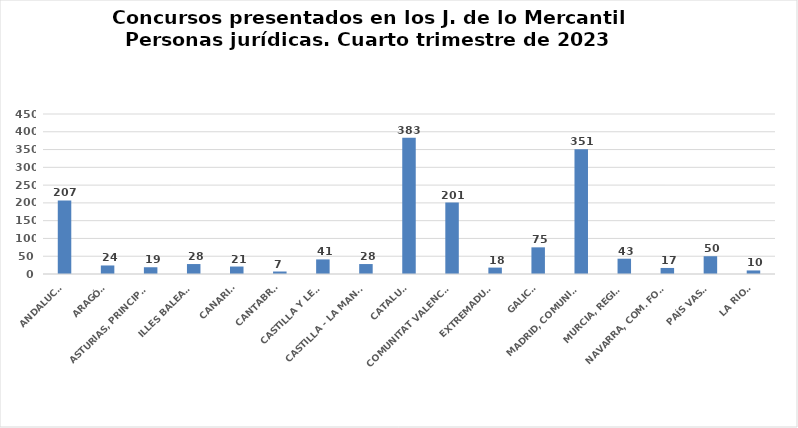
| Category | Series 0 |
|---|---|
| ANDALUCÍA | 207 |
| ARAGÓN | 24 |
| ASTURIAS, PRINCIPADO | 19 |
| ILLES BALEARS | 28 |
| CANARIAS | 21 |
| CANTABRIA | 7 |
| CASTILLA Y LEÓN | 41 |
| CASTILLA - LA MANCHA | 28 |
| CATALUÑA | 383 |
| COMUNITAT VALENCIANA | 201 |
| EXTREMADURA | 18 |
| GALICIA | 75 |
| MADRID, COMUNIDAD | 351 |
| MURCIA, REGIÓN | 43 |
| NAVARRA, COM. FORAL | 17 |
| PAÍS VASCO | 50 |
| LA RIOJA | 10 |